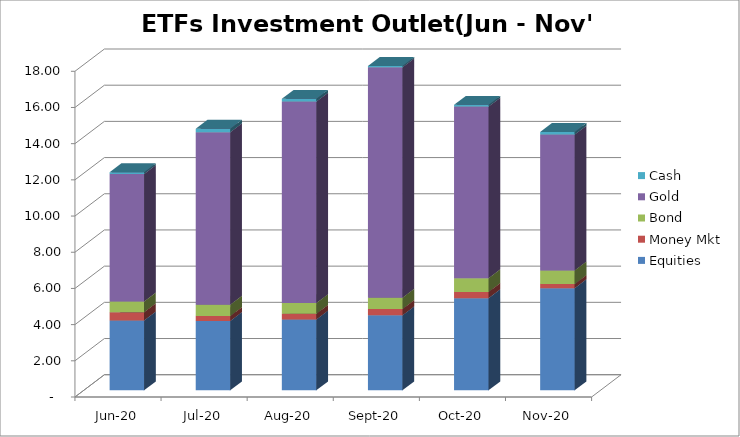
| Category | Equities | Money Mkt | Bond | Gold | Cash |
|---|---|---|---|---|---|
| 2020-06-01 | 3864587279.22 | 452492408.13 | 591048061.03 | 7051738147.24 | 93622092.4 |
| 2020-07-01 | 3831828644.68 | 272103487.34 | 625862830.11 | 9533055643.75 | 191169576.23 |
| 2020-08-01 | 3913723749.54 | 316071867.88 | 592621089.37 | 11135395115.33 | 152002086.71 |
| 2020-09-01 | 4141425949.9 | 349803623.89 | 626583310.45 | 12731001529.98 | 76107936.49 |
| 2020-10-01 | 5094516142.04 | 343013633.71 | 754956015.68 | 9489073502.64 | 94333366.41 |
| 2020-11-01 | 5645946017.69 | 225450504.88 | 753518055.25 | 7507451398.4 | 141335465.56 |